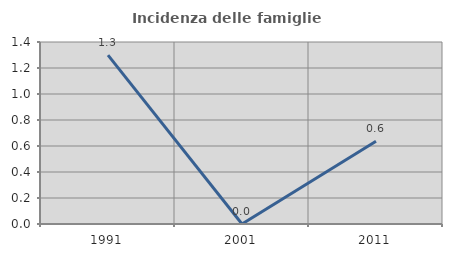
| Category | Incidenza delle famiglie numerose |
|---|---|
| 1991.0 | 1.299 |
| 2001.0 | 0 |
| 2011.0 | 0.637 |